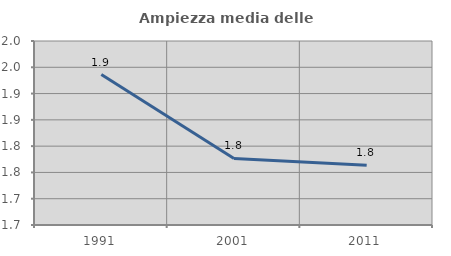
| Category | Ampiezza media delle famiglie |
|---|---|
| 1991.0 | 1.936 |
| 2001.0 | 1.777 |
| 2011.0 | 1.764 |